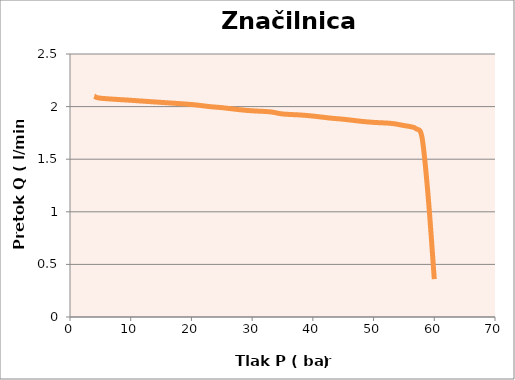
| Category | Q |
|---|---|
| 4.0 | 2.1 |
| 5.0 | 2.08 |
| 10.0 | 2.06 |
| 15.0 | 2.04 |
| 20.0 | 2.02 |
| 23.0 | 2 |
| 25.0 | 1.99 |
| 28.0 | 1.97 |
| 30.0 | 1.96 |
| 33.0 | 1.95 |
| 35.0 | 1.93 |
| 38.0 | 1.92 |
| 40.0 | 1.91 |
| 43.0 | 1.89 |
| 45.0 | 1.88 |
| 48.0 | 1.86 |
| 50.0 | 1.85 |
| 53.0 | 1.84 |
| 55.0 | 1.82 |
| 56.0 | 1.81 |
| 57.0 | 1.79 |
| 58.0 | 1.7 |
| 59.0 | 1.14 |
| 60.0 | 0.36 |